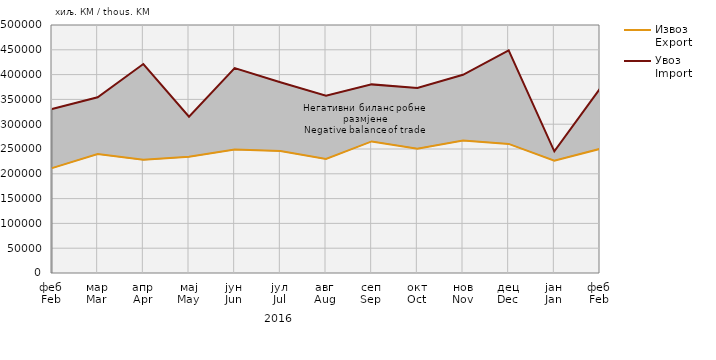
| Category | Извоз
Export | Увоз
Import |
|---|---|---|
| феб
Feb | 211524 | 330459 |
| мар
Mar | 239782 | 354355 |
| апр
Apr | 228100 | 421365 |
| мај
May | 234236 | 315075 |
| јун
Jun | 248861 | 413259 |
| јул
Jul | 245925 | 384444 |
| авг
Aug | 229795 | 357467 |
| сеп
Sep | 265272 | 380274 |
| окт
Oct | 250736 | 372983 |
| нов
Nov | 267042 | 399617 |
| дец
Dec | 260279 | 448853 |
| јан
Jan | 226565 | 245314 |
| феб
Feb | 250292 | 371648 |